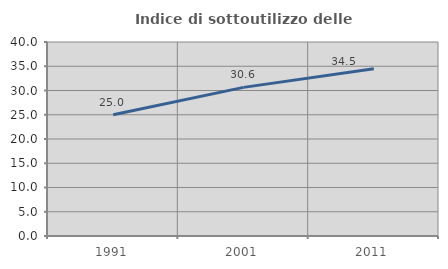
| Category | Indice di sottoutilizzo delle abitazioni  |
|---|---|
| 1991.0 | 25 |
| 2001.0 | 30.644 |
| 2011.0 | 34.468 |